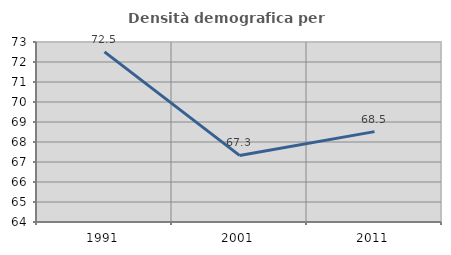
| Category | Densità demografica |
|---|---|
| 1991.0 | 72.509 |
| 2001.0 | 67.33 |
| 2011.0 | 68.518 |